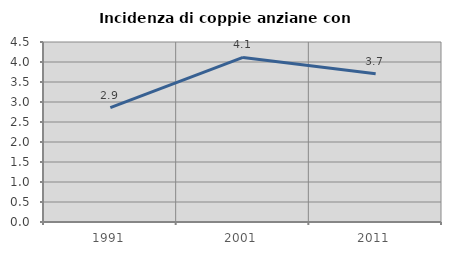
| Category | Incidenza di coppie anziane con figli |
|---|---|
| 1991.0 | 2.862 |
| 2001.0 | 4.115 |
| 2011.0 | 3.704 |